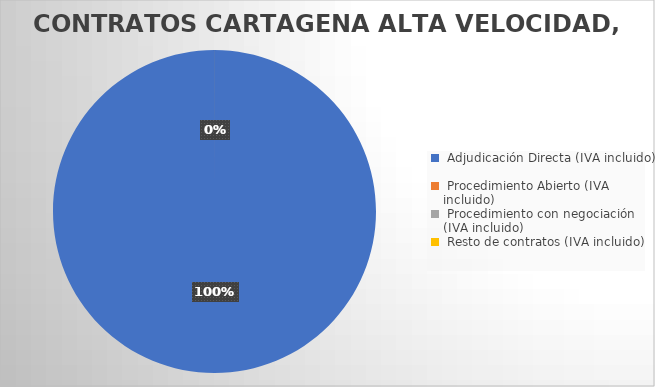
| Category | Series 0 |
|---|---|
|  Adjudicación Directa (IVA incluido)  | 3194.4 |
|  Procedimiento Abierto (IVA incluido)  | 0 |
|  Procedimiento con negociación (IVA incluido)  | 0 |
|  Resto de contratos (IVA incluido)  | 0 |